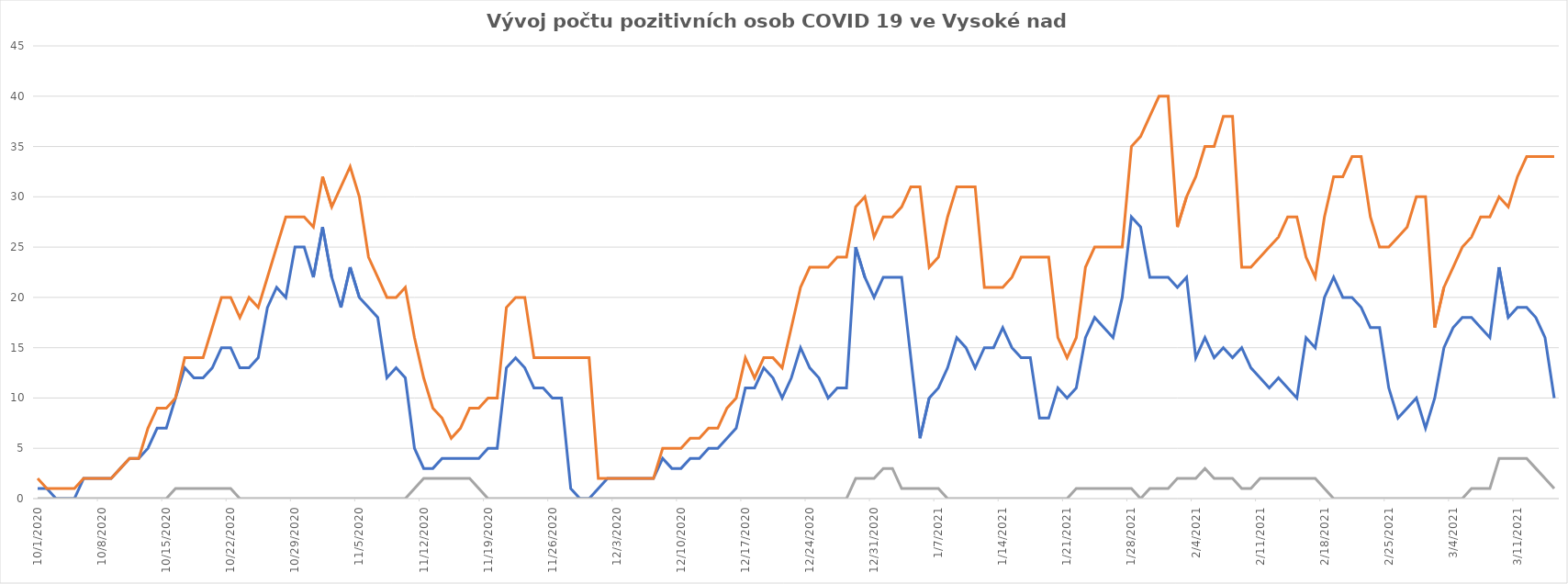
| Category | Series 0 | Series 1 | Series 2 |
|---|---|---|---|
| 10/1/20 | 1 | 2 | 0 |
| 10/2/20 | 1 | 1 | 0 |
| 10/3/20 | 0 | 1 | 0 |
| 10/4/20 | 0 | 1 | 0 |
| 10/5/20 | 0 | 1 | 0 |
| 10/6/20 | 2 | 2 | 0 |
| 10/7/20 | 2 | 2 | 0 |
| 10/8/20 | 2 | 2 | 0 |
| 10/9/20 | 2 | 2 | 0 |
| 10/10/20 | 3 | 3 | 0 |
| 10/11/20 | 4 | 4 | 0 |
| 10/12/20 | 4 | 4 | 0 |
| 10/13/20 | 5 | 7 | 0 |
| 10/14/20 | 7 | 9 | 0 |
| 10/15/20 | 7 | 9 | 0 |
| 10/16/20 | 10 | 10 | 1 |
| 10/17/20 | 13 | 14 | 1 |
| 10/18/20 | 12 | 14 | 1 |
| 10/19/20 | 12 | 14 | 1 |
| 10/20/20 | 13 | 17 | 1 |
| 10/21/20 | 15 | 20 | 1 |
| 10/22/20 | 15 | 20 | 1 |
| 10/23/20 | 13 | 18 | 0 |
| 10/24/20 | 13 | 20 | 0 |
| 10/25/20 | 14 | 19 | 0 |
| 10/26/20 | 19 | 22 | 0 |
| 10/27/20 | 21 | 25 | 0 |
| 10/28/20 | 20 | 28 | 0 |
| 10/29/20 | 25 | 28 | 0 |
| 10/30/20 | 25 | 28 | 0 |
| 10/31/20 | 22 | 27 | 0 |
| 11/1/20 | 27 | 32 | 0 |
| 11/2/20 | 22 | 29 | 0 |
| 11/3/20 | 19 | 31 | 0 |
| 11/4/20 | 23 | 33 | 0 |
| 11/5/20 | 20 | 30 | 0 |
| 11/6/20 | 19 | 24 | 0 |
| 11/7/20 | 18 | 22 | 0 |
| 11/8/20 | 12 | 20 | 0 |
| 11/9/20 | 13 | 20 | 0 |
| 11/10/20 | 12 | 21 | 0 |
| 11/11/20 | 5 | 16 | 1 |
| 11/12/20 | 3 | 12 | 2 |
| 11/13/20 | 3 | 9 | 2 |
| 11/14/20 | 4 | 8 | 2 |
| 11/15/20 | 4 | 6 | 2 |
| 11/16/20 | 4 | 7 | 2 |
| 11/17/20 | 4 | 9 | 2 |
| 11/18/20 | 4 | 9 | 1 |
| 11/19/20 | 5 | 10 | 0 |
| 11/20/20 | 5 | 10 | 0 |
| 11/21/20 | 13 | 19 | 0 |
| 11/22/20 | 14 | 20 | 0 |
| 11/23/20 | 13 | 20 | 0 |
| 11/24/20 | 11 | 14 | 0 |
| 11/25/20 | 11 | 14 | 0 |
| 11/26/20 | 10 | 14 | 0 |
| 11/27/20 | 10 | 14 | 0 |
| 11/28/20 | 1 | 14 | 0 |
| 11/29/20 | 0 | 14 | 0 |
| 11/30/20 | 0 | 14 | 0 |
| 12/1/20 | 1 | 2 | 0 |
| 12/2/20 | 2 | 2 | 0 |
| 12/3/20 | 2 | 2 | 0 |
| 12/4/20 | 2 | 2 | 0 |
| 12/5/20 | 2 | 2 | 0 |
| 12/6/20 | 2 | 2 | 0 |
| 12/7/20 | 2 | 2 | 0 |
| 12/8/20 | 4 | 5 | 0 |
| 12/9/20 | 3 | 5 | 0 |
| 12/10/20 | 3 | 5 | 0 |
| 12/11/20 | 4 | 6 | 0 |
| 12/12/20 | 4 | 6 | 0 |
| 12/13/20 | 5 | 7 | 0 |
| 12/14/20 | 5 | 7 | 0 |
| 12/15/20 | 6 | 9 | 0 |
| 12/16/20 | 7 | 10 | 0 |
| 12/17/20 | 11 | 14 | 0 |
| 12/18/20 | 11 | 12 | 0 |
| 12/19/20 | 13 | 14 | 0 |
| 12/20/20 | 12 | 14 | 0 |
| 12/21/20 | 10 | 13 | 0 |
| 12/22/20 | 12 | 17 | 0 |
| 12/23/20 | 15 | 21 | 0 |
| 12/24/20 | 13 | 23 | 0 |
| 12/25/20 | 12 | 23 | 0 |
| 12/26/20 | 10 | 23 | 0 |
| 12/27/20 | 11 | 24 | 0 |
| 12/28/20 | 11 | 24 | 0 |
| 12/29/20 | 25 | 29 | 2 |
| 12/30/20 | 22 | 30 | 2 |
| 12/31/20 | 20 | 26 | 2 |
| 1/1/21 | 22 | 28 | 3 |
| 1/2/21 | 22 | 28 | 3 |
| 1/3/21 | 22 | 29 | 1 |
| 1/4/21 | 14 | 31 | 1 |
| 1/5/21 | 6 | 31 | 1 |
| 1/6/21 | 10 | 23 | 1 |
| 1/7/21 | 11 | 24 | 1 |
| 1/8/21 | 13 | 28 | 0 |
| 1/9/21 | 16 | 31 | 0 |
| 1/10/21 | 15 | 31 | 0 |
| 1/11/21 | 13 | 31 | 0 |
| 1/12/21 | 15 | 21 | 0 |
| 1/13/21 | 15 | 21 | 0 |
| 1/14/21 | 17 | 21 | 0 |
| 1/15/21 | 15 | 22 | 0 |
| 1/16/21 | 14 | 24 | 0 |
| 1/17/21 | 14 | 24 | 0 |
| 1/18/21 | 8 | 24 | 0 |
| 1/19/21 | 8 | 24 | 0 |
| 1/20/21 | 11 | 16 | 0 |
| 1/21/21 | 10 | 14 | 0 |
| 1/22/21 | 11 | 16 | 1 |
| 1/23/21 | 16 | 23 | 1 |
| 1/24/21 | 18 | 25 | 1 |
| 1/25/21 | 17 | 25 | 1 |
| 1/26/21 | 16 | 25 | 1 |
| 1/27/21 | 20 | 25 | 1 |
| 1/28/21 | 28 | 35 | 1 |
| 1/29/21 | 27 | 36 | 0 |
| 1/30/21 | 22 | 38 | 1 |
| 1/31/21 | 22 | 40 | 1 |
| 2/1/21 | 22 | 40 | 1 |
| 2/2/21 | 21 | 27 | 2 |
| 2/3/21 | 22 | 30 | 2 |
| 2/4/21 | 14 | 32 | 2 |
| 2/5/21 | 16 | 35 | 3 |
| 2/6/21 | 14 | 35 | 2 |
| 2/7/21 | 15 | 38 | 2 |
| 2/8/21 | 14 | 38 | 2 |
| 2/9/21 | 15 | 23 | 1 |
| 2/10/21 | 13 | 23 | 1 |
| 2/11/21 | 12 | 24 | 2 |
| 2/12/21 | 11 | 25 | 2 |
| 2/13/21 | 12 | 26 | 2 |
| 2/14/21 | 11 | 28 | 2 |
| 2/15/21 | 10 | 28 | 2 |
| 2/16/21 | 16 | 24 | 2 |
| 2/17/21 | 15 | 22 | 2 |
| 2/18/21 | 20 | 28 | 1 |
| 2/19/21 | 22 | 32 | 0 |
| 2/20/21 | 20 | 32 | 0 |
| 2/21/21 | 20 | 34 | 0 |
| 2/22/21 | 19 | 34 | 0 |
| 2/23/21 | 17 | 28 | 0 |
| 2/24/21 | 17 | 25 | 0 |
| 2/25/21 | 11 | 25 | 0 |
| 2/26/21 | 8 | 26 | 0 |
| 2/27/21 | 9 | 27 | 0 |
| 2/28/21 | 10 | 30 | 0 |
| 3/1/21 | 7 | 30 | 0 |
| 3/2/21 | 10 | 17 | 0 |
| 3/3/21 | 15 | 21 | 0 |
| 3/4/21 | 17 | 23 | 0 |
| 3/5/21 | 18 | 25 | 0 |
| 3/6/21 | 18 | 26 | 1 |
| 3/7/21 | 17 | 28 | 1 |
| 3/8/21 | 16 | 28 | 1 |
| 3/9/21 | 23 | 30 | 4 |
| 3/10/21 | 18 | 29 | 4 |
| 3/11/21 | 19 | 32 | 4 |
| 3/12/21 | 19 | 34 | 4 |
| 3/13/21 | 18 | 34 | 3 |
| 3/14/21 | 16 | 34 | 2 |
| 3/15/21 | 10 | 34 | 1 |